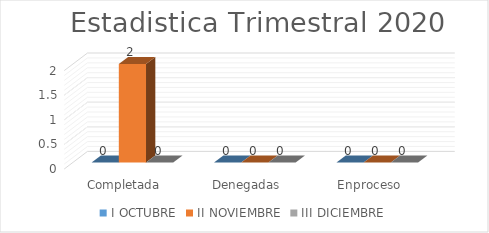
| Category | I | II | III |
|---|---|---|---|
| Completada | 0 | 2 | 0 |
| Denegadas | 0 | 0 | 0 |
| Enproceso | 0 | 0 | 0 |